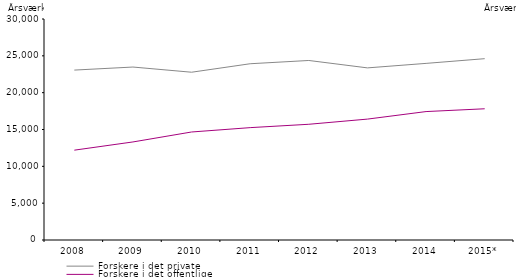
| Category | Forskere i det private | Forskere i det offentlige |
|---|---|---|
| 2008 | 23065 | 12194 |
| 2009 | 23479 | 13310 |
| 2010 | 22774 | 14662 |
| 2011 | 23927 | 15253 |
| 2012 | 24369 | 15710 |
| 2013 | 23364 | 16412 |
| 2014 | 23975 | 17433 |
| 2015* | 24613 | 17813 |